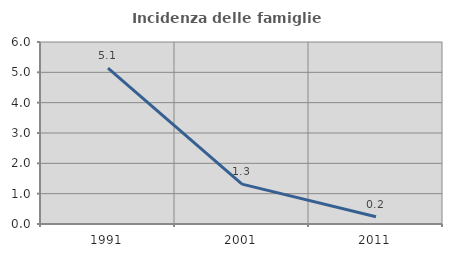
| Category | Incidenza delle famiglie numerose |
|---|---|
| 1991.0 | 5.141 |
| 2001.0 | 1.314 |
| 2011.0 | 0.238 |